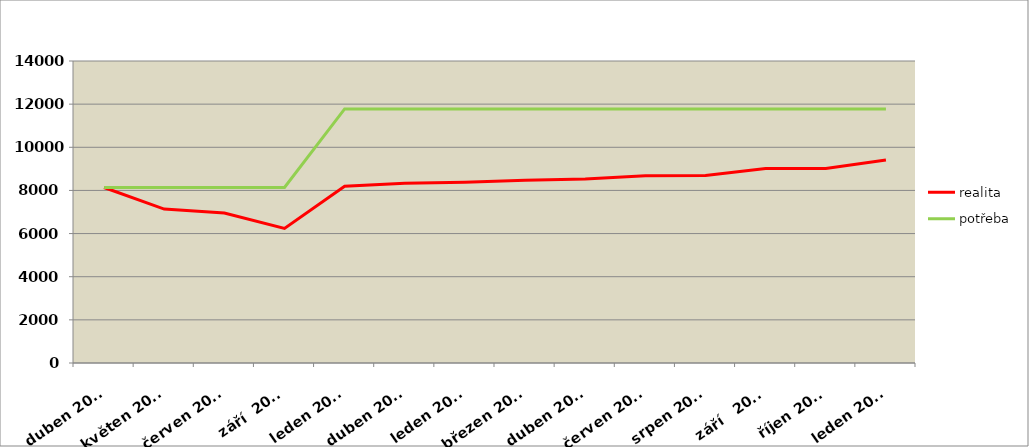
| Category | realita | potřeba |
|---|---|---|
| duben 2011 | 8136 | 8136 |
| květen 2011 | 7136 | 8136 |
| červen 2011 | 6951 | 8136 |
|   září  2011 | 6237 | 8136 |
| leden 2012 | 8190 | 11778 |
| duben 2012 | 8329 | 11778 |
| leden 2013 | 8382 | 11778 |
| březen 2013 | 8472 | 11778 |
| duben 2013 | 8532 | 11778 |
| červen 2013 | 8676 | 11778 |
| srpen 2013 | 8692 | 11778 |
|    září   2013 | 9011 | 11778 |
| říjen 2013 | 9020 | 11778 |
| leden 2014 | 9407 | 11778 |